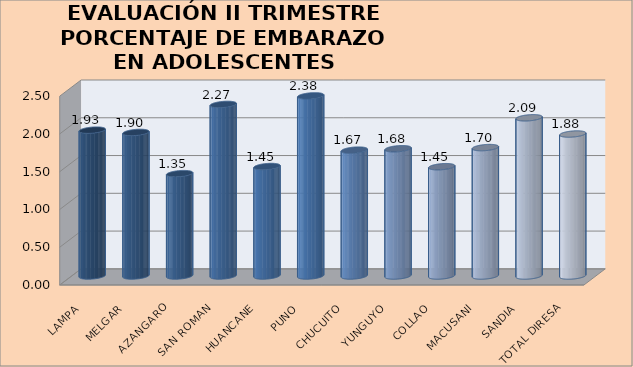
| Category | ATENDIDOS |
|---|---|
| LAMPA | 1.931 |
| MELGAR | 1.9 |
| AZANGARO | 1.355 |
| SAN ROMAN | 2.271 |
| HUANCANE | 1.449 |
| PUNO | 2.385 |
| CHUCUITO | 1.666 |
| YUNGUYO | 1.685 |
| COLLAO | 1.447 |
| MACUSANI | 1.7 |
| SANDIA | 2.094 |
| TOTAL DIRESA | 1.879 |